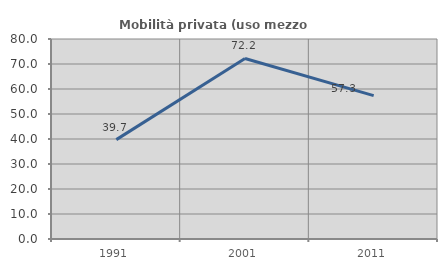
| Category | Mobilità privata (uso mezzo privato) |
|---|---|
| 1991.0 | 39.744 |
| 2001.0 | 72.222 |
| 2011.0 | 57.333 |